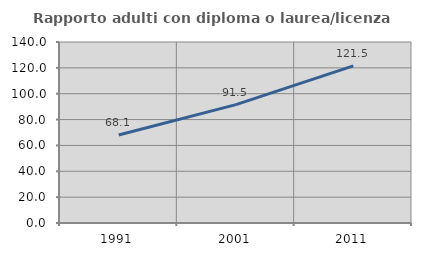
| Category | Rapporto adulti con diploma o laurea/licenza media  |
|---|---|
| 1991.0 | 68.079 |
| 2001.0 | 91.537 |
| 2011.0 | 121.531 |